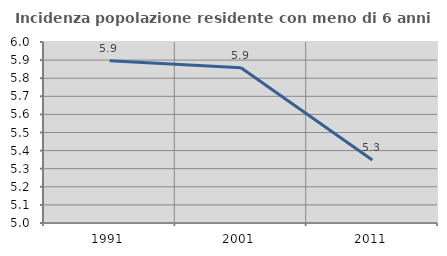
| Category | Incidenza popolazione residente con meno di 6 anni |
|---|---|
| 1991.0 | 5.896 |
| 2001.0 | 5.857 |
| 2011.0 | 5.349 |